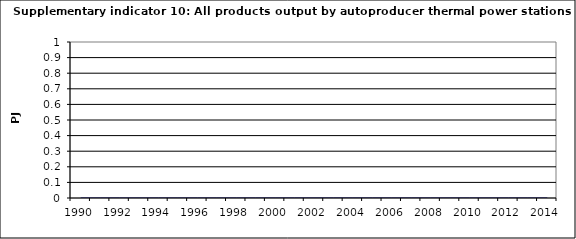
| Category | All products output by autoproducer thermal power stations, PJ |
|---|---|
| 1990 | 0 |
| 1991 | 0 |
| 1992 | 0 |
| 1993 | 0 |
| 1994 | 0 |
| 1995 | 0 |
| 1996 | 0 |
| 1997 | 0 |
| 1998 | 0 |
| 1999 | 0 |
| 2000 | 0 |
| 2001 | 0 |
| 2002 | 0 |
| 2003 | 0 |
| 2004 | 0 |
| 2005 | 0 |
| 2006 | 0 |
| 2007 | 0 |
| 2008 | 0 |
| 2009 | 0 |
| 2010 | 0 |
| 2011 | 0 |
| 2012 | 0 |
| 2013 | 0 |
| 2014 | 0 |